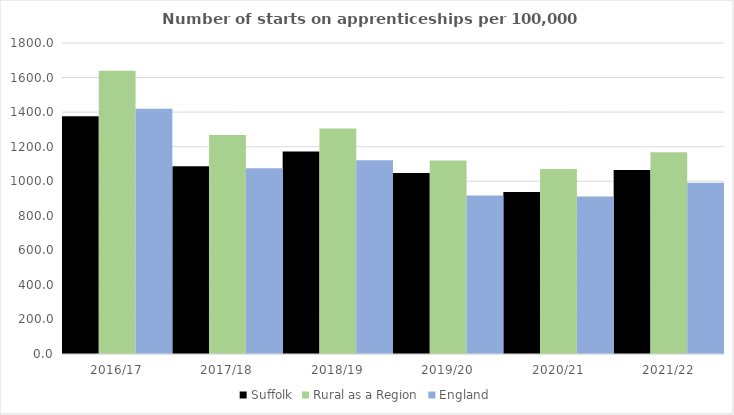
| Category | Suffolk | Rural as a Region | England |
|---|---|---|---|
| 2016/17 | 1376.579 | 1638.789 | 1420 |
| 2017/18 | 1087.255 | 1267.474 | 1075 |
| 2018/19 | 1171.685 | 1304.57 | 1122 |
| 2019/20 | 1047.525 | 1119.662 | 918 |
| 2020/21 | 937.5 | 1070.748 | 912 |
| 2021/22 | 1065.647 | 1167.68 | 991 |